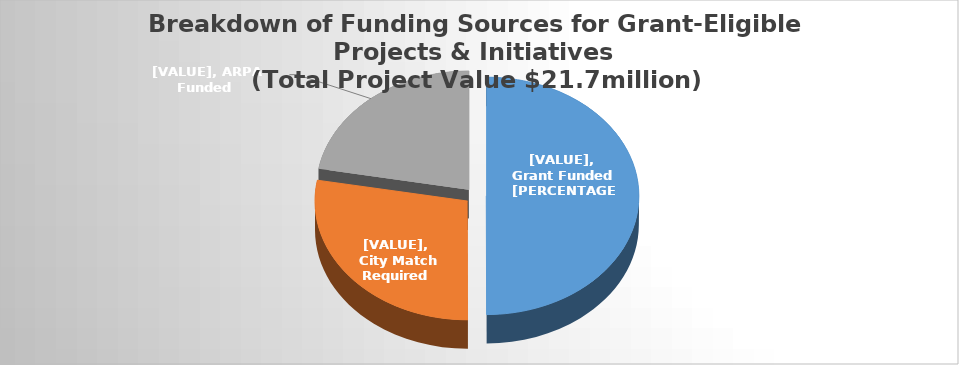
| Category | Grant Amount |
|---|---|
| 0 | 10877894.03 |
| 1 | 6063450.36 |
| 2 | 4830068 |